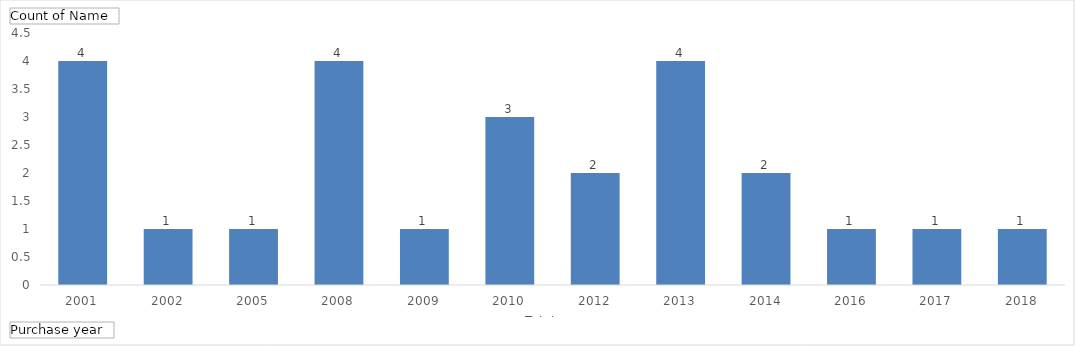
| Category | Total |
|---|---|
| 2001 | 4 |
| 2002 | 1 |
| 2005 | 1 |
| 2008 | 4 |
| 2009 | 1 |
| 2010 | 3 |
| 2012 | 2 |
| 2013 | 4 |
| 2014 | 2 |
| 2016 | 1 |
| 2017 | 1 |
| 2018 | 1 |